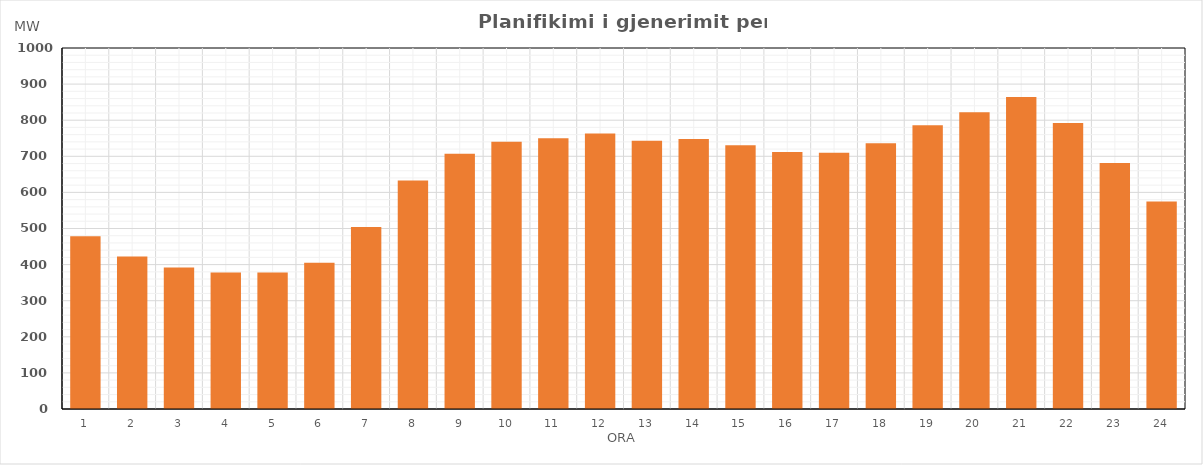
| Category | Max (MW) |
|---|---|
| 0 | 478.61 |
| 1 | 422.16 |
| 2 | 391.72 |
| 3 | 377.99 |
| 4 | 377.98 |
| 5 | 405.16 |
| 6 | 503.89 |
| 7 | 632.87 |
| 8 | 707.3 |
| 9 | 740.21 |
| 10 | 749.71 |
| 11 | 762.98 |
| 12 | 743.15 |
| 13 | 747.68 |
| 14 | 730.95 |
| 15 | 711.69 |
| 16 | 709.91 |
| 17 | 736.3 |
| 18 | 786.19 |
| 19 | 822.32 |
| 20 | 864.17 |
| 21 | 792.46 |
| 22 | 681.74 |
| 23 | 574.67 |